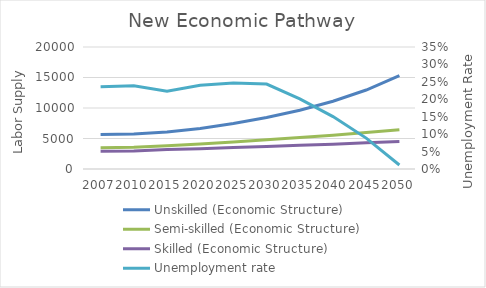
| Category | Unskilled (Economic Structure) | Semi-skilled (Economic Structure) | Skilled (Economic Structure) |
|---|---|---|---|
| 2007.0 | 5674.118 | 3485.45 | 2906.004 |
| 2010.0 | 5741.516 | 3548.565 | 2949.812 |
| 2015.0 | 6065.487 | 3822.812 | 3177.785 |
| 2020.0 | 6657.861 | 4118.254 | 3339.884 |
| 2025.0 | 7444.986 | 4436.53 | 3510.252 |
| 2030.0 | 8438.301 | 4779.402 | 3689.31 |
| 2035.0 | 9639.538 | 5148.774 | 3877.502 |
| 2040.0 | 11113.932 | 5546.692 | 4075.293 |
| 2045.0 | 12948.32 | 5975.362 | 4283.174 |
| 2050.0 | 15302.017 | 6437.162 | 4501.659 |